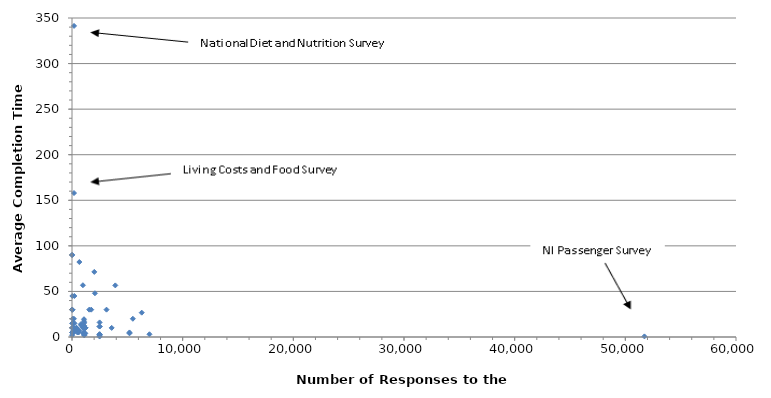
| Category | Series 0 |
|---|---|
| 7.0 | 2 |
| 7.0 | 30 |
| 8.0 | 10 |
| 8.0 | 90 |
| 9.0 | 5 |
| 9.0 | 90 |
| 11.0 | 30 |
| 14.0 | 15 |
| 24.0 | 30 |
| 30.0 | 45 |
| 32.0 | 30 |
| 33.0 | 10 |
| 59.0 | 5 |
| 62.0 | 20 |
| 72.0 | 5 |
| 77.0 | 15 |
| 89.0 | 10 |
| 97.0 | 15 |
| 100.0 | 5 |
| 100.0 | 10 |
| 100.0 | 10 |
| 100.0 | 10 |
| 100.0 | 10 |
| 100.0 | 10 |
| 100.0 | 10 |
| 100.0 | 10 |
| 100.0 | 10 |
| 100.0 | 10 |
| 100.0 | 10 |
| 100.0 | 10 |
| 100.0 | 10 |
| 100.0 | 10 |
| 100.0 | 10 |
| 100.0 | 10 |
| 100.0 | 10 |
| 111.0 | 10 |
| 134.0 | 7 |
| 154.0 | 5 |
| 173.0 | 20 |
| 180.0 | 157.972 |
| 185.0 | 341.324 |
| 206.0 | 7 |
| 212.0 | 45 |
| 227.0 | 15 |
| 262.0 | 7 |
| 385.0 | 10 |
| 400.0 | 7 |
| 421.0 | 10 |
| 461.0 | 8 |
| 491.0 | 5 |
| 602.0 | 5 |
| 663.0 | 82.262 |
| 685.0 | 7 |
| 800.0 | 14 |
| 846.0 | 12.674 |
| 988.0 | 56.806 |
| 1000.0 | 10.4 |
| 1021.0 | 10 |
| 1029.0 | 10.96 |
| 1056.0 | 5 |
| 1084.0 | 3.61 |
| 1084.0 | 3.61 |
| 1084.0 | 17.329 |
| 1084.0 | 19.495 |
| 1109.0 | 1.792 |
| 1109.0 | 2.39 |
| 1109.0 | 2.987 |
| 1109.0 | 3.585 |
| 1109.0 | 4.779 |
| 1109.0 | 12.192 |
| 1109.0 | 15.533 |
| 1156.0 | 10 |
| 1156.0 | 10 |
| 1156.0 | 10 |
| 1156.0 | 10 |
| 1156.0 | 10 |
| 1200.0 | 4 |
| 1202.0 | 10.129 |
| 1202.0 | 10.129 |
| 1202.0 | 10.129 |
| 1561.0 | 30 |
| 1738.0 | 30 |
| 2015.0 | 71.402 |
| 2074.0 | 48 |
| 2495.0 | 0.5 |
| 2495.0 | 2 |
| 2495.0 | 2.5 |
| 2495.0 | 3 |
| 2495.0 | 3 |
| 2495.0 | 11.5 |
| 2495.0 | 11.5 |
| 2495.0 | 16 |
| 3119.0 | 30 |
| 3584.0 | 10 |
| 3915.0 | 56.621 |
| 5194.0 | 4 |
| 5194.0 | 5 |
| 5498.0 | 20 |
| 6300.0 | 26.694 |
| 7000.0 | 3 |
| 51724.0 | 0.655 |